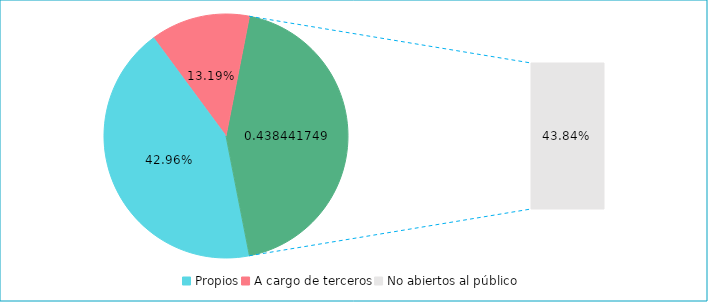
| Category | Series 0 |
|---|---|
| Propios | 0.43 |
| A cargo de terceros | 0.132 |
| No abiertos al público | 0.438 |